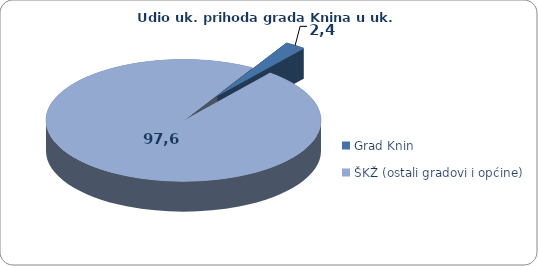
| Category | Ukupni prihod | Udio |
|---|---|---|
| Grad Knin | 214527.544 | 2.435 |
| ŠKŽ (ostali gradovi i općine) | 8595391 | 97.565 |